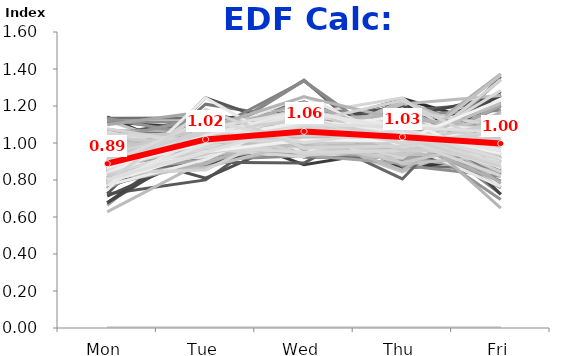
| Category | 12/31/90 | 1/7/91 | 1/14/91 | 1/21/91 | 1/28/91 | 2/4/91 | 2/11/91 | 2/18/91 | 2/25/91 | 3/4/91 | 3/11/91 | 3/18/91 | 3/25/91 | 4/1/91 | 4/8/91 | 4/15/91 | 4/22/91 | 4/29/91 | 5/6/91 | 5/13/91 | 5/20/91 | 5/27/91 | 6/3/91 | 6/10/91 | 6/17/91 | 6/24/91 | 7/1/91 | 7/8/91 | 7/15/91 | 7/22/91 | 7/29/91 | 8/5/91 | 8/12/91 | 8/19/91 | 8/26/91 | 9/2/91 | 9/9/91 | 9/16/91 | 9/23/91 | 9/30/91 | 10/7/91 | 10/14/91 | 10/21/91 | 10/28/91 | 11/4/91 | 11/11/91 | 11/18/91 | 11/25/91 | 12/2/91 | 12/9/91 | 12/16/91 | 12/23/91 | 12/30/91 | 1/6/92 | 1/13/92 | 1/20/92 | 1/27/92 | 2/3/92 | 2/10/92 | 2/17/92 | 2/24/92 | 3/2/92 | 3/9/92 | 3/16/92 | 3/23/92 | 3/30/92 | 4/6/92 | 4/13/92 | 4/20/92 | 4/27/92 | 5/4/92 | 5/11/92 | 5/18/92 | 5/25/92 | 6/1/92 | 6/8/92 | 6/15/92 | 6/22/92 | 6/29/92 | 7/6/92 | 7/13/92 | 7/20/92 | 7/27/92 | 8/3/92 | 8/10/92 | 8/17/92 | 8/24/92 | 8/31/92 | 9/7/92 | 9/14/92 | 9/21/92 | 9/28/92 | 10/5/92 | 10/12/92 | 10/19/92 | 10/26/92 | 11/2/92 | 11/9/92 | 11/16/92 | 11/23/92 | 11/30/92 | 12/7/92 | 12/14/92 | 12/21/92 | 12/28/92 | 1/4/93 | 1/11/93 | 1/18/93 | 1/25/93 | 2/1/93 | 2/8/93 | 2/15/93 | 2/22/93 | 3/1/93 | 3/8/93 | 3/15/93 | 3/22/93 | 3/29/93 | 4/5/93 | 4/12/93 | 4/19/93 | 4/26/93 | 5/3/93 | 5/10/93 | 5/17/93 | 5/24/93 | 5/31/93 | 6/7/93 | 6/14/93 | 6/21/93 | 6/28/93 | 7/5/93 | 7/12/93 | 7/19/93 | 7/26/93 | 8/2/93 | 8/9/93 | 8/16/93 | 8/23/93 | 8/30/93 | 9/6/93 | 9/13/93 | 9/20/93 | 9/27/93 | 10/4/93 | 10/11/93 | 10/18/93 | 10/25/93 | 11/1/93 | 11/8/93 | 11/15/93 | 11/22/93 | 11/29/93 | 12/6/93 | 12/13/93 | 12/20/93 | 12/27/93 | 1/3/94 | 1/10/94 | 1/17/94 | 1/24/94 | 1/31/94 | 2/7/94 | 2/14/94 | 2/21/94 | 2/28/94 | 3/7/94 | 3/14/94 | 3/21/94 | 3/28/94 | 4/4/94 | 4/11/94 | 4/18/94 | 4/25/94 | 5/2/94 | 5/9/94 | 5/16/94 | 5/23/94 | 5/30/94 | 6/6/94 | 6/13/94 | 6/20/94 | 6/27/94 | 7/4/94 | 7/11/94 | 7/18/94 | 7/25/94 | 8/1/94 | 8/8/94 | 8/15/94 | 8/22/94 | 8/29/94 | 9/5/94 | 9/12/94 | 9/19/94 | 9/26/94 | 10/3/94 | 10/10/94 | 10/17/94 | 10/24/94 | 10/31/94 | 11/7/94 | 11/14/94 | 11/21/94 | 11/28/94 | 12/5/94 | 12/12/94 | 12/19/94 | 12/26/94 | 1/2/95 | 1/9/95 | 1/16/95 | 1/23/95 | 1/30/95 | 2/6/95 | 2/13/95 | 2/20/95 | 2/27/95 | 3/6/95 | 3/13/95 | 3/20/95 | 3/27/95 | 4/3/95 | 4/10/95 | 4/17/95 | 4/24/95 | 5/1/95 | 5/8/95 | 5/15/95 | 5/22/95 | 5/29/95 | 6/5/95 | 6/12/95 | 6/19/95 | 6/26/95 | 7/3/95 | 7/10/95 | 7/17/95 | 7/24/95 | 7/31/95 | 8/7/95 | 8/14/95 | 8/21/95 | 8/28/95 | 9/4/95 | 9/11/95 | 9/18/95 | 9/25/95 | 10/2/95 | 10/9/95 | 10/16/95 | FINAL: |
|---|---|---|---|---|---|---|---|---|---|---|---|---|---|---|---|---|---|---|---|---|---|---|---|---|---|---|---|---|---|---|---|---|---|---|---|---|---|---|---|---|---|---|---|---|---|---|---|---|---|---|---|---|---|---|---|---|---|---|---|---|---|---|---|---|---|---|---|---|---|---|---|---|---|---|---|---|---|---|---|---|---|---|---|---|---|---|---|---|---|---|---|---|---|---|---|---|---|---|---|---|---|---|---|---|---|---|---|---|---|---|---|---|---|---|---|---|---|---|---|---|---|---|---|---|---|---|---|---|---|---|---|---|---|---|---|---|---|---|---|---|---|---|---|---|---|---|---|---|---|---|---|---|---|---|---|---|---|---|---|---|---|---|---|---|---|---|---|---|---|---|---|---|---|---|---|---|---|---|---|---|---|---|---|---|---|---|---|---|---|---|---|---|---|---|---|---|---|---|---|---|---|---|---|---|---|---|---|---|---|---|---|---|---|---|---|---|---|---|---|---|---|---|---|---|---|---|---|---|---|---|---|---|---|---|---|---|---|---|---|---|---|---|---|---|---|---|---|---|---|---|---|---|
| Mon | 0 | 0.914 | 0 | 0.757 | 0.724 | 0.966 | 1.115 | 0 | 0.957 | 0.895 | 0.82 | 0.91 | 0 | 0.771 | 0.789 | 0.778 | 1.001 | 0.849 | 0.81 | 0.753 | 0.726 | 0 | 0.992 | 0.828 | 0.83 | 0.852 | 0 | 0.869 | 0.869 | 1.005 | 0.839 | 0.812 | 0.792 | 1.141 | 0.877 | 0 | 0.784 | 0 | 0.907 | 0.913 | 0.9 | 0.663 | 0.874 | 0.858 | 0.88 | 0.677 | 1.134 | 0 | 1.017 | 0.901 | 0 | 0 | 0 | 0.948 | 0.713 | 0.839 | 0.909 | 0.8 | 0.873 | 0 | 0.848 | 0.906 | 0.885 | 0.792 | 0.886 | 0.753 | 0.842 | 0 | 0.903 | 0.891 | 0.958 | 0.842 | 0.87 | 0 | 0.938 | 0.849 | 0.768 | 0.95 | 0 | 0.945 | 0.781 | 0.948 | 0.797 | 0.939 | 0.842 | 0.85 | 0.95 | 0.939 | 0 | 1.122 | 0.811 | 0.878 | 0 | 0.676 | 1.002 | 0.941 | 0.987 | 0.912 | 0.829 | 0 | 0.974 | 1.007 | 0 | 0 | 0 | 0.77 | 0.828 | 0.777 | 1.042 | 0.779 | 1.006 | 0 | 1.115 | 0.926 | 1.04 | 0.792 | 0.956 | 0.792 | 0 | 0.952 | 0.862 | 1.067 | 0.903 | 0.935 | 0.81 | 0.82 | 0 | 0.975 | 0.858 | 0.899 | 0.92 | 0 | 0.793 | 0.869 | 0.878 | 0.989 | 0.93 | 0.848 | 0.859 | 0.843 | 0 | 0.866 | 0.855 | 0.928 | 0.878 | 0.628 | 1.075 | 0.933 | 0.818 | 0.827 | 0.843 | 0 | 0.988 | 1.025 | 0.849 | 0 | 0.848 | 0.822 | 1.052 | 0.774 | 0.938 | 0.965 | 1.133 | 0.88 | 0 | 0.873 | 0.912 | 0 | 0.902 | 0 | 1.098 | 0.887 | 0.83 | 0 | 1.06 | 0.93 | 0.79 | 1.019 | 0 | 1.06 | 0.839 | 0.883 | 0.982 | 0 | 0.826 | 0.876 | 0.88 | 0.953 | 0.843 | 0.79 | 0.816 | 0.94 | 0 | 0.799 | 0.887 | 0.913 | 0.909 | 0.746 | 0.815 | 0.874 | 0.997 | 0.926 | 0.823 | 0 | 0.931 | 0.838 | 0.808 | 0.898 | 0 | 0 | 0.86 | 0.939 | 1.002 | 0.845 | 1.028 | 0.771 | 0 | 0.879 | 0.878 | 0.802 | 0.902 | 0.862 | 0.934 | 0 | 0.915 | 0.956 | 0.839 | 0.838 | 0.906 | 0.854 | 0 | 1.041 | 0.831 | 0.872 | 0.904 | 0 | 1.077 | 0.822 | 0.9 | 0.871 | 0.948 | 0.796 | 1.052 | 0.911 | 0 | 0.787 | 0.892 | 0.772 | 0.888 | 0.788 | 0.803 | 0.888 |
| Tue | 0 | 1.008 | 0 | 0.978 | 0.8 | 1.119 | 1.078 | 0 | 0.81 | 1.126 | 0.896 | 0.986 | 0 | 1.017 | 0.967 | 1.035 | 1.024 | 1.164 | 0.968 | 1.21 | 1.245 | 0 | 1.028 | 1.047 | 0.964 | 0.97 | 0 | 0.947 | 0.98 | 1.082 | 1.055 | 1.116 | 1.16 | 0.913 | 0.972 | 0 | 0.975 | 0 | 1.088 | 1.009 | 1.072 | 1.091 | 1.102 | 1.023 | 0.973 | 1.042 | 1.136 | 0 | 1.01 | 0.993 | 0 | 0 | 0 | 0.955 | 0.947 | 1.016 | 1.033 | 1.013 | 0.928 | 0 | 0.984 | 1.035 | 1.118 | 0.96 | 1.085 | 1.027 | 0.96 | 0 | 1.009 | 0.973 | 1.101 | 1.031 | 1.087 | 0 | 1 | 1.005 | 0.91 | 1.07 | 0 | 1.144 | 1.027 | 0.993 | 1.055 | 0.952 | 1.029 | 0.955 | 1.164 | 1.014 | 0 | 0.945 | 0.989 | 0.943 | 0 | 0.998 | 1.149 | 1.003 | 1.01 | 1.03 | 0.886 | 0 | 1.081 | 1.075 | 0 | 0 | 0 | 0.924 | 0.91 | 1.102 | 1.134 | 0.887 | 0.994 | 0 | 1.113 | 1.079 | 1.087 | 0.884 | 0.954 | 0.909 | 0 | 1.047 | 1.12 | 1.066 | 1.076 | 0.88 | 0.942 | 0.923 | 0 | 0.988 | 0.928 | 1.048 | 1.05 | 0 | 0.928 | 1.115 | 1.007 | 1.052 | 1.021 | 0.949 | 1.098 | 1.1 | 0 | 0.912 | 1.115 | 0.921 | 1.125 | 0.906 | 0.991 | 1.019 | 0.974 | 0.983 | 1.019 | 0 | 1.05 | 1.003 | 0.91 | 0 | 1.007 | 0.962 | 1.006 | 1.024 | 1.027 | 0.965 | 1.036 | 1.025 | 0 | 0.994 | 0.951 | 0 | 1.034 | 0 | 1.17 | 0.94 | 0.99 | 0 | 1.029 | 1.096 | 1.049 | 1.142 | 0 | 0.952 | 0.995 | 1.152 | 1.049 | 0 | 0.936 | 0.967 | 0.953 | 1.084 | 1.012 | 1.076 | 1.064 | 1.041 | 0 | 0.966 | 1.044 | 0.971 | 1.097 | 1.244 | 0.887 | 0.991 | 1.037 | 1.044 | 1.073 | 0 | 1.007 | 0.969 | 0.867 | 1.08 | 0 | 0 | 1.083 | 0.991 | 0.968 | 1.086 | 0.996 | 0.91 | 0 | 0.976 | 1.041 | 1.008 | 1.098 | 0.931 | 1.048 | 0 | 0.943 | 1.032 | 0.855 | 1.05 | 1.053 | 1.078 | 0 | 1.049 | 0.976 | 1.038 | 1.066 | 0 | 0.991 | 0.939 | 1.065 | 1 | 1.05 | 0.994 | 1.008 | 1.062 | 0 | 0.953 | 1.008 | 1.04 | 1.125 | 1.181 | 0.95 | 1.019 |
| Wed | 0 | 1.34 | 0 | 0.942 | 1.164 | 1.068 | 0.883 | 0 | 1.045 | 1.173 | 0.892 | 1.093 | 0 | 1.145 | 0.996 | 1.192 | 1.018 | 1.032 | 0.994 | 1.125 | 1.055 | 0 | 1.063 | 1.076 | 0.988 | 1.158 | 0 | 1.112 | 1.044 | 1.073 | 1.041 | 1.101 | 1.066 | 1.153 | 1.154 | 0 | 1.008 | 0 | 0.977 | 1.015 | 1.131 | 1.149 | 1.062 | 1.063 | 0.945 | 0.97 | 0.923 | 0 | 1.014 | 1.07 | 0 | 0 | 0 | 1.099 | 1.115 | 1.06 | 1.186 | 1.137 | 1.104 | 0 | 1.129 | 1.048 | 1.026 | 0.988 | 1.09 | 1.043 | 1.171 | 0 | 1.03 | 1.064 | 1.094 | 0.939 | 1.14 | 0 | 1.063 | 1.11 | 1.138 | 1.088 | 0 | 1.017 | 1.094 | 1.097 | 1.335 | 0.984 | 1.043 | 1.038 | 0.986 | 1.089 | 0 | 1.032 | 1.082 | 1.019 | 0 | 0.934 | 0.98 | 1.016 | 0.943 | 1.125 | 1.034 | 0 | 1.009 | 1.056 | 0 | 0 | 0 | 1.13 | 0.932 | 1.023 | 1.002 | 1.128 | 1.041 | 0 | 1.072 | 1.085 | 0.956 | 0.975 | 1.128 | 1.098 | 0 | 0.94 | 1.012 | 0.999 | 1.1 | 1.015 | 1.221 | 1.154 | 0 | 1.02 | 1.063 | 1.123 | 1.081 | 0 | 1.164 | 1.12 | 1.071 | 0.957 | 1.074 | 1.135 | 1.222 | 1.074 | 0 | 1.056 | 1.078 | 1.052 | 1.093 | 0.999 | 1.002 | 1.002 | 1.095 | 1.008 | 1.071 | 0 | 1.065 | 1.1 | 1.097 | 0 | 1.336 | 1.178 | 1.023 | 1.03 | 0.96 | 0.984 | 1.083 | 0.988 | 0 | 1.176 | 0.989 | 0 | 1.04 | 0 | 0.964 | 1.018 | 1.12 | 0 | 0.956 | 1.027 | 1.137 | 1.037 | 0 | 1.049 | 0.933 | 0.969 | 1.038 | 0 | 0.986 | 1.031 | 1.038 | 1.038 | 1.093 | 1.106 | 1.076 | 1.254 | 0 | 0.975 | 1.138 | 1.104 | 1.176 | 0.943 | 1.09 | 0.98 | 1.097 | 1.221 | 0.938 | 0 | 1.055 | 0.925 | 1.005 | 1.249 | 0 | 0 | 1.06 | 1.017 | 1.05 | 1.048 | 1.011 | 1.147 | 0 | 1.113 | 1.024 | 0.983 | 0.935 | 1.123 | 1.006 | 0 | 1.033 | 1.033 | 1.11 | 1.1 | 1.005 | 1.175 | 0 | 1.009 | 0.95 | 1.081 | 1.121 | 0 | 1.087 | 1.204 | 1.137 | 1.125 | 1.04 | 1.174 | 1.014 | 1.126 | 0 | 1.016 | 1.094 | 1.177 | 1.001 | 0.975 | 1.103 | 1.063 |
| Thu | 0 | 0.876 | 0 | 1.241 | 1.05 | 1.123 | 0.968 | 0 | 1.1 | 0.881 | 1.175 | 1.113 | 0 | 1.062 | 1.118 | 1.049 | 1.018 | 1.057 | 1.137 | 0.899 | 1.147 | 0 | 0.959 | 0.952 | 1.013 | 1.007 | 0 | 0.985 | 1.077 | 0.981 | 1.058 | 1.049 | 0.95 | 0.858 | 1.034 | 0 | 1.091 | 0 | 1.01 | 1.063 | 0.995 | 1.05 | 1.015 | 0.964 | 1.167 | 1.052 | 0.923 | 0 | 0.894 | 0.996 | 0 | 0 | 0 | 1.105 | 1.2 | 1.09 | 0.929 | 1.049 | 1.07 | 0 | 1.006 | 1.048 | 0.992 | 1.004 | 0.999 | 1.042 | 1.091 | 0 | 1.12 | 1.155 | 0.925 | 1.071 | 1.061 | 0 | 1.007 | 1.078 | 1.056 | 1.024 | 0 | 1.059 | 1.088 | 1.026 | 0.937 | 1.037 | 1.098 | 1.019 | 1.026 | 1.235 | 0 | 0.844 | 0.991 | 1.124 | 0 | 1.134 | 0.974 | 1.027 | 1.067 | 1.043 | 1.035 | 0 | 0.975 | 1.106 | 0 | 0 | 0 | 1.167 | 1.154 | 0.982 | 0.929 | 1.146 | 1.062 | 0 | 0.879 | 0.917 | 0.961 | 0.975 | 1.032 | 0.922 | 0 | 0.948 | 1.092 | 0.938 | 1.025 | 1.167 | 1.031 | 1.244 | 0 | 0.957 | 0.954 | 1.08 | 1.11 | 0 | 1.086 | 1.003 | 1.046 | 1.085 | 1.115 | 1.065 | 1.027 | 1.126 | 0 | 0.806 | 1.026 | 1.113 | 0.974 | 1.211 | 0.945 | 1.079 | 1.035 | 1.022 | 1.052 | 0 | 0.925 | 1.01 | 0.941 | 0 | 0.96 | 1.083 | 0.915 | 1.026 | 1.091 | 0.953 | 1.054 | 1.138 | 0 | 0.942 | 1.18 | 0 | 1.111 | 0 | 0.924 | 1.027 | 1.157 | 0 | 0.913 | 1.011 | 1.035 | 1.044 | 0 | 1.031 | 0.89 | 0.989 | 1.149 | 0 | 1.229 | 1.118 | 1.016 | 1.081 | 1.074 | 1.039 | 0.985 | 1 | 0 | 0.918 | 0.97 | 1.021 | 0.886 | 1.182 | 1.132 | 0.996 | 0.939 | 1.019 | 1.02 | 0 | 1.012 | 1.176 | 0.951 | 1.124 | 0 | 0 | 0.961 | 0.928 | 0.933 | 0.853 | 1.028 | 1.097 | 0 | 1.015 | 0.937 | 0.991 | 0.961 | 1.056 | 1.014 | 0 | 1 | 1.032 | 1.231 | 0.981 | 1.01 | 1.024 | 0 | 0.895 | 0.958 | 1.145 | 0.961 | 0 | 1.022 | 0.96 | 1.011 | 1.063 | 1.052 | 1.073 | 1.038 | 1.029 | 0 | 1.012 | 1.001 | 1.052 | 1.071 | 0.984 | 1.085 | 1.033 |
| Fri | 0 | 0.863 | 0 | 1.082 | 1.262 | 0.723 | 0.956 | 0 | 1.087 | 0.925 | 1.218 | 0.898 | 0 | 1.004 | 1.129 | 0.946 | 0.939 | 0.899 | 1.091 | 1.013 | 0.827 | 0 | 0.957 | 1.097 | 1.205 | 1.012 | 0 | 1.088 | 1.029 | 0.859 | 1.008 | 0.922 | 1.033 | 0.935 | 0.964 | 0 | 1.143 | 0 | 1.018 | 0.999 | 0.902 | 1.047 | 0.947 | 1.092 | 1.035 | 1.259 | 0.885 | 0 | 1.065 | 1.04 | 0 | 0 | 0 | 0.893 | 1.024 | 0.995 | 0.942 | 1.001 | 1.026 | 0 | 1.034 | 0.964 | 0.98 | 1.256 | 0.939 | 1.135 | 0.936 | 0 | 0.938 | 0.917 | 0.921 | 1.117 | 0.842 | 0 | 0.991 | 0.958 | 1.128 | 0.866 | 0 | 0.834 | 1.009 | 0.937 | 0.875 | 1.087 | 0.987 | 1.138 | 0.874 | 0.722 | 0 | 1.058 | 1.127 | 1.036 | 0 | 1.258 | 0.895 | 1.013 | 0.994 | 0.89 | 1.217 | 0 | 0.962 | 0.757 | 0 | 0 | 0 | 1.009 | 1.176 | 1.116 | 0.894 | 1.06 | 0.896 | 0 | 0.821 | 0.994 | 0.956 | 1.374 | 0.93 | 1.28 | 0 | 1.112 | 0.914 | 0.93 | 0.896 | 1.002 | 0.995 | 0.859 | 0 | 1.06 | 1.196 | 0.85 | 0.839 | 0 | 1.029 | 0.893 | 0.998 | 0.917 | 0.861 | 1.003 | 0.794 | 0.857 | 0 | 1.36 | 0.926 | 0.986 | 0.931 | 1.257 | 0.987 | 0.968 | 1.078 | 1.159 | 1.015 | 0 | 0.972 | 0.862 | 1.204 | 0 | 0.849 | 0.955 | 1.004 | 1.146 | 0.984 | 1.133 | 0.695 | 0.969 | 0 | 1.016 | 0.968 | 0 | 0.913 | 0 | 0.843 | 1.128 | 0.903 | 0 | 1.041 | 0.936 | 0.989 | 0.758 | 0 | 0.908 | 1.343 | 1.007 | 0.781 | 0 | 1.023 | 1.008 | 1.114 | 0.845 | 0.978 | 0.989 | 1.058 | 0.764 | 0 | 1.342 | 0.961 | 0.991 | 0.932 | 0.884 | 1.076 | 1.159 | 0.93 | 0.789 | 1.145 | 0 | 0.995 | 1.092 | 1.368 | 0.648 | 0 | 0 | 1.036 | 1.124 | 1.047 | 1.168 | 0.937 | 1.074 | 0 | 1.017 | 1.121 | 1.216 | 1.104 | 1.028 | 0.997 | 0 | 1.11 | 0.946 | 0.967 | 1.031 | 1.026 | 0.869 | 0 | 1.007 | 1.284 | 0.864 | 0.948 | 0 | 0.823 | 1.075 | 0.887 | 0.942 | 0.91 | 0.964 | 0.889 | 0.872 | 0 | 1.232 | 1.004 | 0.959 | 0.915 | 1.071 | 1.059 | 0.997 |